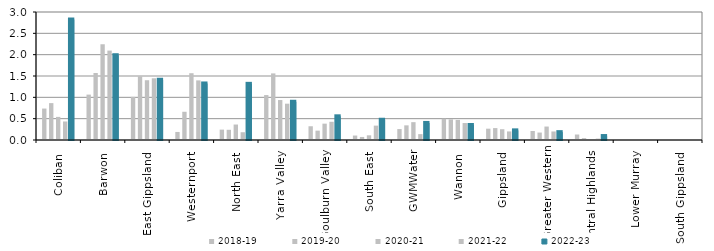
| Category | 2018-19 | 2019-20 | 2020-21 | 2021-22 | 2022-23 |
|---|---|---|---|---|---|
| Coliban  | 0.737 | 0.864 | 0.542 | 0.434 | 2.824 |
| Barwon  | 1.064 | 1.57 | 2.244 | 2.095 | 1.987 |
| East Gippsland  | 1.01 | 1.494 | 1.401 | 1.447 | 1.412 |
| Westernport  | 0.189 | 0.662 | 1.566 | 1.397 | 1.325 |
| North East  | 0.243 | 0.239 | 0.363 | 0.182 | 1.316 |
| Yarra Valley  | 1.053 | 1.561 | 0.937 | 0.851 | 0.896 |
| Goulburn Valley  | 0.322 | 0.219 | 0.383 | 0.427 | 0.555 |
| South East  | 0.105 | 0.071 | 0.11 | 0.337 | 0.475 |
| GWMWater | 0.257 | 0.343 | 0.418 | 0.137 | 0.4 |
| Wannon  | 0.499 | 0.484 | 0.471 | 0.398 | 0.352 |
| Gippsland  | 0.265 | 0.279 | 0.253 | 0.201 | 0.226 |
| Greater Western | 0.211 | 0.174 | 0.315 | 0.2 | 0.184 |
| Central Highlands  | 0.129 | 0.044 | 0.016 | 0.033 | 0.093 |
| Lower Murray  | 0 | 0.007 | 0.003 | 0 | 0 |
| South Gippsland  | 0.006 | 0 | 0.006 | 0 | 0 |